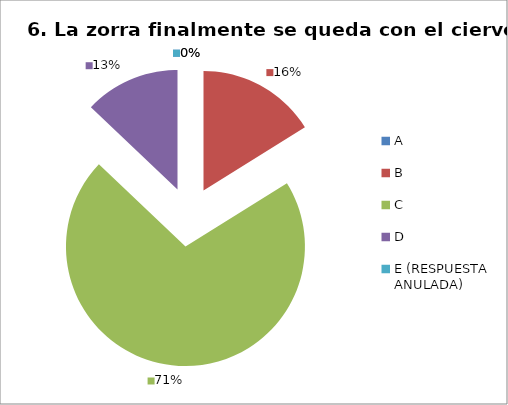
| Category | CANTIDAD DE RESPUESTAS PREGUNTA (6) | PORCENTAJE |
|---|---|---|
| A | 0 | 0 |
| B | 5 | 0.161 |
| C | 22 | 0.71 |
| D | 4 | 0.129 |
| E (RESPUESTA ANULADA) | 0 | 0 |